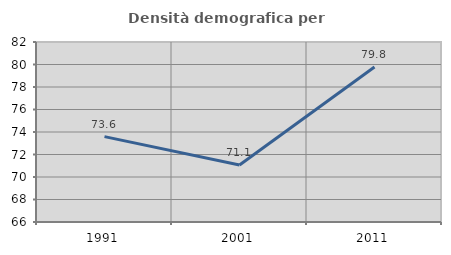
| Category | Densità demografica |
|---|---|
| 1991.0 | 73.591 |
| 2001.0 | 71.063 |
| 2011.0 | 79.771 |